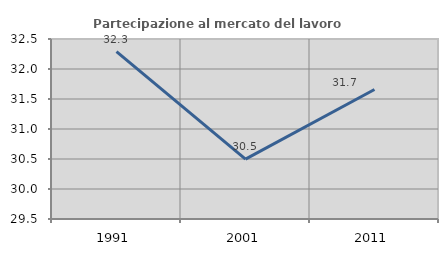
| Category | Partecipazione al mercato del lavoro  femminile |
|---|---|
| 1991.0 | 32.288 |
| 2001.0 | 30.498 |
| 2011.0 | 31.658 |